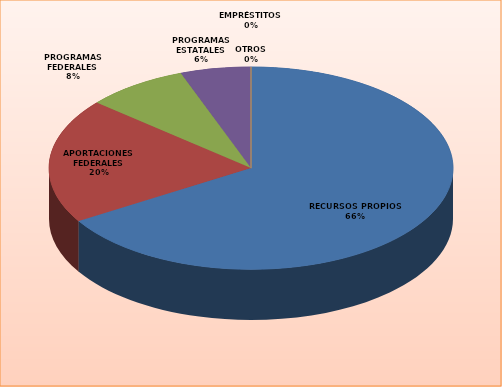
| Category | Series 0 |
|---|---|
| RECURSOS PROPIOS | 53715803 |
| APORTACIONES FEDERALES | 16190245 |
| PROGRAMAS FEDERALES | 6602973 |
| PROGRAMAS ESTATALES | 4575722 |
| EMPRÉSTITOS | 0 |
| OTROS | 0 |